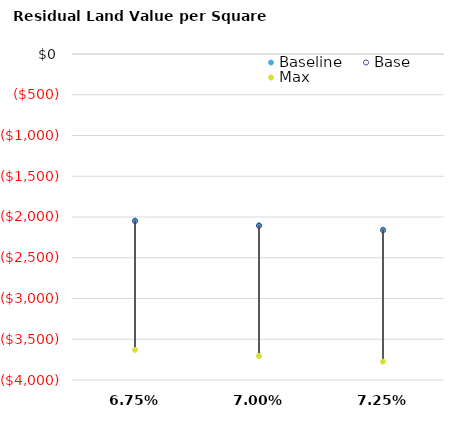
| Category | Baseline | Base | Max |
|---|---|---|---|
| 0.0675 | -2041.519 | -2051.343 | -3629.864 |
| 0.07 | -2099.821 | -2109.645 | -3704.612 |
| 0.07250000000000001 | -2154.102 | -2163.925 | -3774.205 |